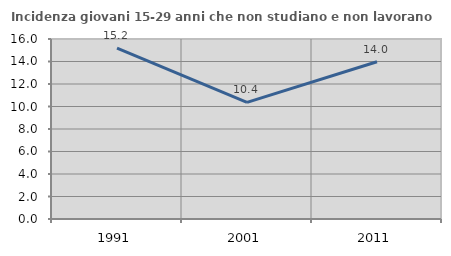
| Category | Incidenza giovani 15-29 anni che non studiano e non lavorano  |
|---|---|
| 1991.0 | 15.187 |
| 2001.0 | 10.372 |
| 2011.0 | 13.977 |